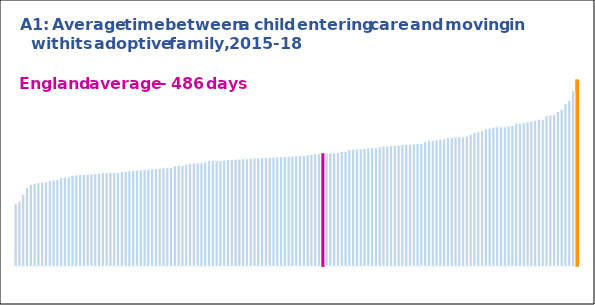
| Category | 0 | N/A |
|---|---|---|
| 0 | 0 | 268 |
| 1 | 0 | 278 |
| 2 | 0 | 309 |
| 3 | 0 | 339 |
| 4 | 0 | 352 |
| 5 | 0 | 356 |
| 6 | 0 | 359 |
| 7 | 0 | 361 |
| 8 | 0 | 363 |
| 9 | 0 | 369 |
| 10 | 0 | 371 |
| 11 | 0 | 372 |
| 12 | 0 | 381 |
| 13 | 0 | 382 |
| 14 | 0 | 383 |
| 15 | 0 | 391 |
| 16 | 0 | 392 |
| 17 | 0 | 395 |
| 18 | 0 | 395 |
| 19 | 0 | 396 |
| 20 | 0 | 397 |
| 21 | 0 | 398 |
| 22 | 0 | 399 |
| 23 | 0 | 402 |
| 24 | 0 | 403 |
| 25 | 0 | 403 |
| 26 | 0 | 403 |
| 27 | 0 | 404 |
| 28 | 0 | 407 |
| 29 | 0 | 408 |
| 30 | 0 | 410 |
| 31 | 0 | 412 |
| 32 | 0 | 413 |
| 33 | 0 | 414 |
| 34 | 0 | 416 |
| 35 | 0 | 418 |
| 36 | 0 | 418 |
| 37 | 0 | 420 |
| 38 | 0 | 421 |
| 39 | 0 | 423 |
| 40 | 0 | 424 |
| 41 | 0 | 425 |
| 42 | 0 | 431 |
| 43 | 0 | 433 |
| 44 | 0 | 434 |
| 45 | 0 | 438 |
| 46 | 0 | 441 |
| 47 | 0 | 444 |
| 48 | 0 | 445 |
| 49 | 0 | 445 |
| 50 | 0 | 448 |
| 51 | 0 | 454 |
| 52 | 0 | 454 |
| 53 | 0 | 454 |
| 54 | 0 | 454 |
| 55 | 0 | 456 |
| 56 | 0 | 459 |
| 57 | 0 | 459 |
| 58 | 0 | 460 |
| 59 | 0 | 461 |
| 60 | 0 | 462 |
| 61 | 0 | 462 |
| 62 | 0 | 463 |
| 63 | 0 | 466 |
| 64 | 0 | 466 |
| 65 | 0 | 467 |
| 66 | 0 | 467 |
| 67 | 0 | 468 |
| 68 | 0 | 469 |
| 69 | 0 | 470 |
| 70 | 0 | 471 |
| 71 | 0 | 472 |
| 72 | 0 | 473 |
| 73 | 0 | 474 |
| 74 | 0 | 474 |
| 75 | 0 | 476 |
| 76 | 0 | 477 |
| 77 | 0 | 479 |
| 78 | 0 | 481 |
| 79 | 0 | 485 |
| 80 | 0 | 486 |
| 81 | 0 | 0 |
| 82 | 0 | 487 |
| 83 | 0 | 487 |
| 84 | 0 | 488 |
| 85 | 0 | 489 |
| 86 | 0 | 494 |
| 87 | 0 | 494 |
| 88 | 0 | 502 |
| 89 | 0 | 503 |
| 90 | 0 | 504 |
| 91 | 0 | 505 |
| 92 | 0 | 507 |
| 93 | 0 | 509 |
| 94 | 0 | 510 |
| 95 | 0 | 510 |
| 96 | 0 | 514 |
| 97 | 0 | 517 |
| 98 | 0 | 517 |
| 99 | 0 | 519 |
| 100 | 0 | 520 |
| 101 | 0 | 521 |
| 102 | 0 | 524 |
| 103 | 0 | 525 |
| 104 | 0 | 525 |
| 105 | 0 | 527 |
| 106 | 0 | 528 |
| 107 | 0 | 529 |
| 108 | 0 | 536 |
| 109 | 0 | 540 |
| 110 | 0 | 541 |
| 111 | 0 | 544 |
| 112 | 0 | 547 |
| 113 | 0 | 548 |
| 114 | 0 | 553 |
| 115 | 0 | 553 |
| 116 | 0 | 556 |
| 117 | 0 | 557 |
| 118 | 0 | 557 |
| 119 | 0 | 560 |
| 120 | 0 | 568 |
| 121 | 0 | 576 |
| 122 | 0 | 578 |
| 123 | 0 | 583 |
| 124 | 0 | 592 |
| 125 | 0 | 594 |
| 126 | 0 | 599 |
| 127 | 0 | 600 |
| 128 | 0 | 600 |
| 129 | 0 | 600 |
| 130 | 0 | 604 |
| 131 | 0 | 606 |
| 132 | 0 | 615 |
| 133 | 0 | 615 |
| 134 | 0 | 617 |
| 135 | 0 | 622 |
| 136 | 0 | 625 |
| 137 | 0 | 628 |
| 138 | 0 | 633 |
| 139 | 0 | 633 |
| 140 | 0 | 648 |
| 141 | 0 | 651 |
| 142 | 0 | 652 |
| 143 | 0 | 666 |
| 144 | 0 | 676 |
| 145 | 0 | 701 |
| 146 | 0 | 714 |
| 147 | 0 | 756 |
| 148 | 805 | 0 |